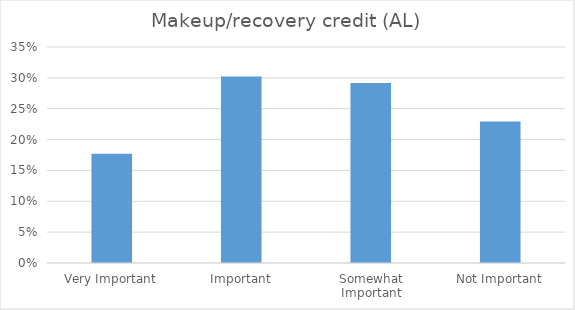
| Category | Makeup/recovery credit (AL) |
|---|---|
| Very Important | 0.177 |
| Important | 0.302 |
| Somewhat Important | 0.292 |
| Not Important | 0.229 |